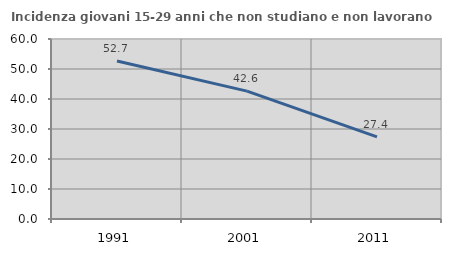
| Category | Incidenza giovani 15-29 anni che non studiano e non lavorano  |
|---|---|
| 1991.0 | 52.671 |
| 2001.0 | 42.631 |
| 2011.0 | 27.376 |